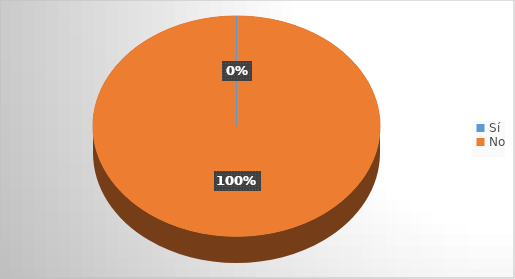
| Category | Series 0 |
|---|---|
| Sí | 0 |
| No | 92 |